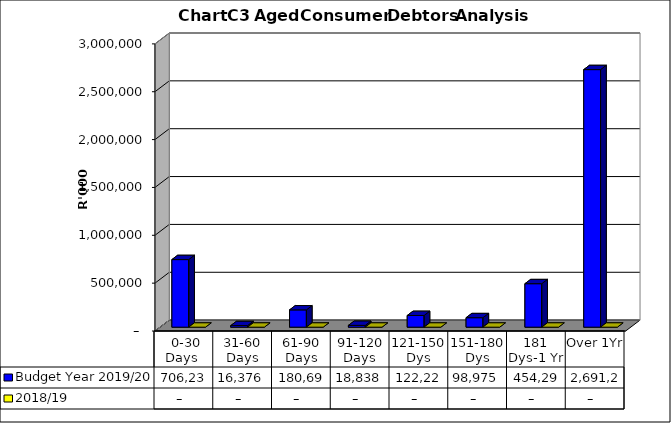
| Category | Budget Year 2019/20 | 2018/19 |
|---|---|---|
|  0-30 Days  | 706236012.39 | 0 |
| 31-60 Days | 16375525.92 | 0 |
| 61-90 Days | 180699068.26 | 0 |
| 91-120 Days | 18837669.8 | 0 |
| 121-150 Dys | 122221189.28 | 0 |
| 151-180 Dys | 98975212.93 | 0 |
| 181 Dys-1 Yr | 454294899.35 | 0 |
| Over 1Yr | 2691237135.48 | 0 |